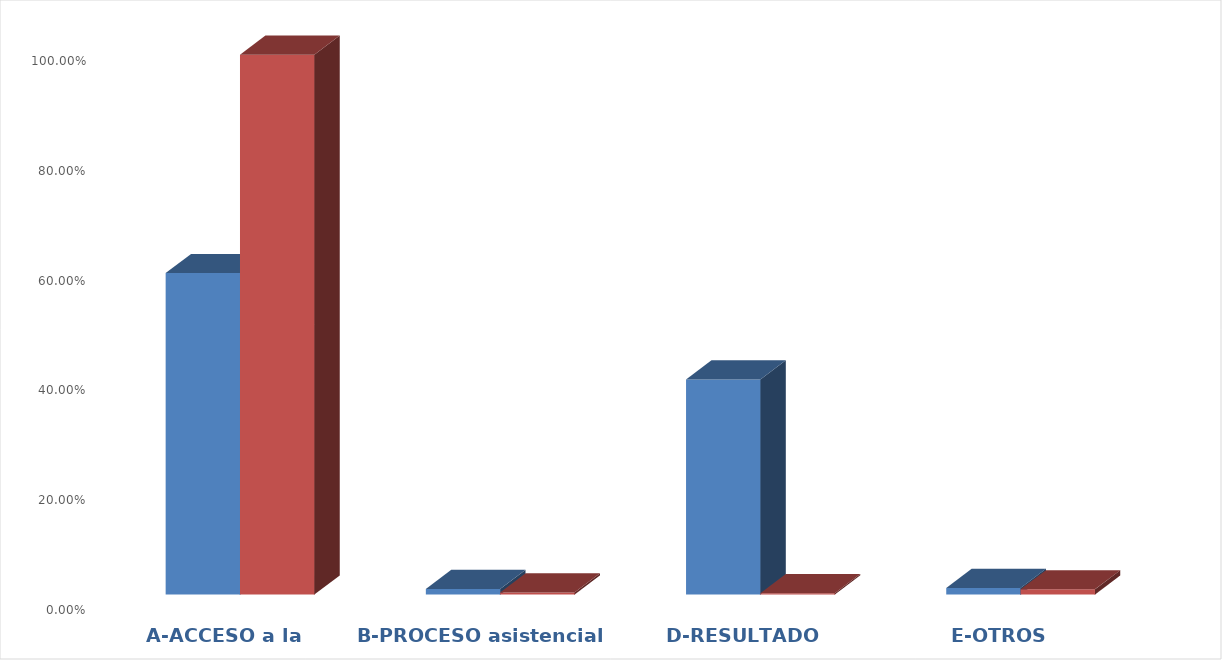
| Category | Series 0 | Series 1 |
|---|---|---|
| A-ACCESO a la asistencia | 0.586 | 0.983 |
| B-PROCESO asistencial | 0.01 | 0.004 |
| D-RESULTADO asistencial | 0.392 | 0.003 |
| E-OTROS | 0.012 | 0.01 |